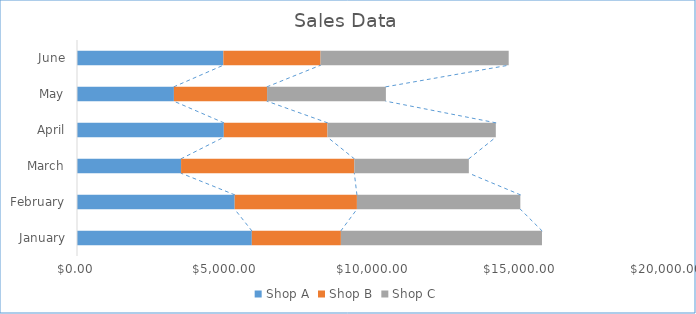
| Category | Shop A | Shop B | Shop C |
|---|---|---|---|
| January | 5926 | 3020 | 6816 |
| February | 5345 | 4144 | 5539 |
| March | 3528 | 5873 | 3882 |
| April | 4977 | 3513 | 5707 |
| May | 3285 | 3158 | 4028 |
| June | 4961 | 3296 | 6377 |